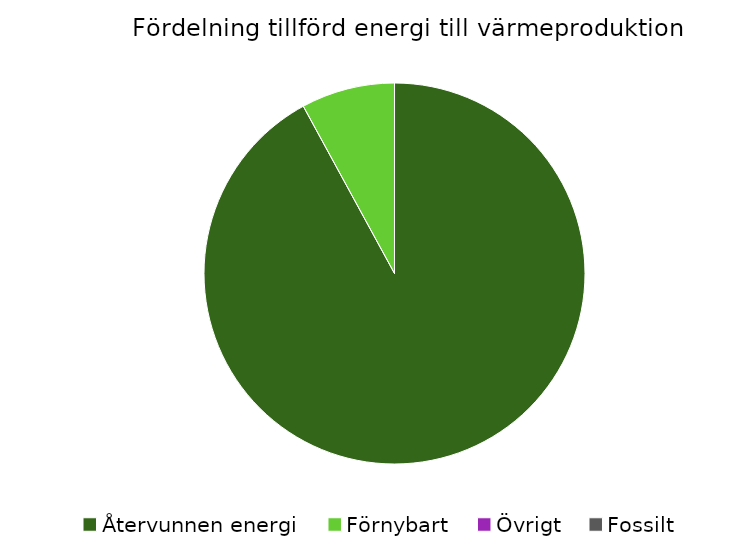
| Category | Fördelning värmeproduktion |
|---|---|
| Återvunnen energi | 0.921 |
| Förnybart | 0.079 |
| Övrigt | 0 |
| Fossilt | 0 |